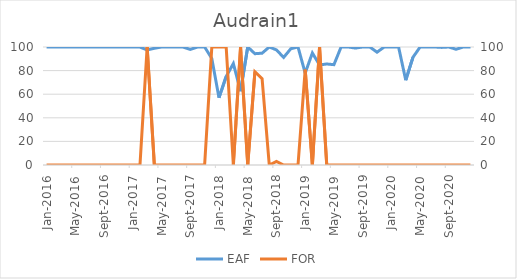
| Category | EAF |
|---|---|
| 2016-01-01 | 100 |
| 2016-02-01 | 100 |
| 2016-03-01 | 100 |
| 2016-04-01 | 100 |
| 2016-05-01 | 100 |
| 2016-06-01 | 100 |
| 2016-07-01 | 100 |
| 2016-08-01 | 100 |
| 2016-09-01 | 100 |
| 2016-10-01 | 100 |
| 2016-11-01 | 100 |
| 2016-12-01 | 100 |
| 2017-01-01 | 100 |
| 2017-02-01 | 100 |
| 2017-03-01 | 97.51 |
| 2017-04-01 | 98.96 |
| 2017-05-01 | 100 |
| 2017-06-01 | 100 |
| 2017-07-01 | 100 |
| 2017-08-01 | 100 |
| 2017-09-01 | 97.95 |
| 2017-10-01 | 100 |
| 2017-11-01 | 100 |
| 2017-12-01 | 90.26 |
| 2018-01-01 | 57.06 |
| 2018-02-01 | 75 |
| 2018-03-01 | 85.94 |
| 2018-04-01 | 62.57 |
| 2018-05-01 | 100 |
| 2018-06-01 | 94.32 |
| 2018-07-01 | 94.76 |
| 2018-08-01 | 100 |
| 2018-09-01 | 97.53 |
| 2018-10-01 | 91.17 |
| 2018-11-01 | 98.54 |
| 2018-12-01 | 100 |
| 2019-01-01 | 77.89 |
| 2019-02-01 | 94.94 |
| 2019-03-01 | 84.79 |
| 2019-04-01 | 85.61 |
| 2019-05-01 | 85.03 |
| 2019-06-01 | 100 |
| 2019-07-01 | 100 |
| 2019-08-01 | 99.09 |
| 2019-09-01 | 100 |
| 2019-10-01 | 100 |
| 2019-11-01 | 95.6 |
| 2019-12-01 | 100 |
| 2020-01-01 | 100 |
| 2020-02-01 | 100 |
| 2020-03-01 | 71.87 |
| 2020-04-01 | 91.25 |
| 2020-05-01 | 100 |
| 2020-06-01 | 100 |
| 2020-07-01 | 100 |
| 2020-08-01 | 99.66 |
| 2020-09-01 | 100 |
| 2020-10-01 | 98.06 |
| 2020-11-01 | 100 |
| 2020-12-01 | 100 |